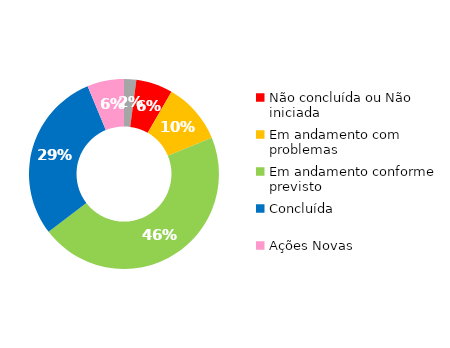
| Category | Series 0 |
|---|---|
| Início planejado posterior | 1 |
| Não concluída ou Não iniciada | 3 |
| Em andamento com problemas | 5 |
| Em andamento conforme previsto | 22 |
| Concluída | 14 |
| Ações Novas | 3 |